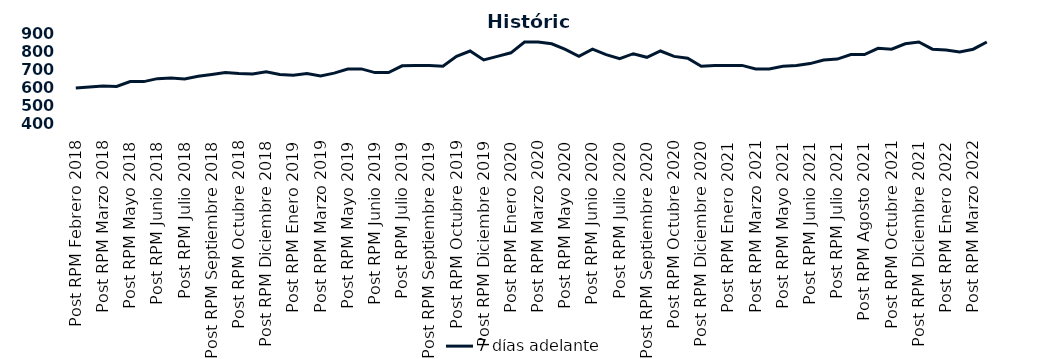
| Category | 7 días adelante  |
|---|---|
| Post RPM Febrero 2018 | 595 |
| Pre RPM Marzo 2018 | 600 |
| Post RPM Marzo 2018 | 605 |
| Pre RPM Mayo 2018 | 603 |
| Post RPM Mayo 2018 | 630 |
| Pre RPM Junio 2018 | 630 |
| Post RPM Junio 2018 | 646.5 |
| Pre RPM Julio 2018 | 650 |
| Post RPM Julio 2018 | 645 |
| Pre RPM Septiembre 2018 | 660 |
| Post RPM Septiembre 2018 | 670 |
| Pre RPM Octubre 2018 | 680 |
| Post RPM Octubre 2018 | 675 |
| Pre RPM Diciembre 2018 | 672.5 |
| Post RPM Diciembre 2018 | 685 |
| Pre RPM Enero 2019 | 670 |
| Post RPM Enero 2019 | 665 |
| Pre RPM Marzo 2019 | 675 |
| Post RPM Marzo 2019 | 661 |
| Pre RPM Mayo 2019 | 677 |
| Post RPM Mayo 2019 | 700 |
| Pre RPM Junio 2019 | 700.5 |
| Post RPM Junio 2019 | 680 |
| Pre RPM Julio 2019 | 680 |
| Post RPM Julio 2019 | 717.5 |
| Pre RPM Septiembre 2019 | 720 |
| Post RPM Septiembre 2019 | 720 |
| Pre RPM Octubre 2019 | 715 |
| Post RPM Octubre 2019 | 770 |
| Pre RPM Diciembre 2019 | 800 |
| Post RPM Diciembre 2019 | 750 |
| Pre RPM Enero 2020 | 770 |
| Post RPM Enero 2020 | 790 |
| Pre RPM Marzo 2020 | 850 |
| Post RPM Marzo 2020 | 850 |
| Pre RPM Mayo 2020 | 840 |
| Post RPM Mayo 2020 | 808.5 |
| Pre RPM Junio 2020 | 770 |
| Post RPM Junio 2020 | 810 |
| Pre RPM Julio 2020 | 780 |
| Post RPM Julio 2020 | 757 |
| Pre RPM Septiembre 2020 | 785 |
| Post RPM Septiembre 2020 | 765 |
| Pre RPM Octubre 2020 | 800 |
| Post RPM Octubre 2020 | 770 |
| Pre RPM Diciembre 2020 | 760 |
| Post RPM Diciembre 2020 | 715 |
| Pre RPM Enero 2021 | 720 |
| Post RPM Enero 2021 | 720 |
| Pre RPM Marzo 2021 | 720 |
| Post RPM Marzo 2021 | 700 |
| Pre RPM Mayo 2021 | 700 |
| Post RPM Mayo 2021 | 715 |
| Pre RPM Junio 2021 | 720 |
| Post RPM Junio 2021 | 730 |
| Pre RPM Julio 2021 | 750 |
| Post RPM Julio 2021 | 755 |
| Pre RPM Agosto 2021 | 780 |
| Post RPM Agosto 2021 | 780 |
| Pre RPM Octubre 2021 | 815 |
| Post RPM Octubre 2021 | 810 |
| Pre RPM Diciembre 2021 | 840 |
| Post RPM Diciembre 2021 | 850 |
| Pre RPM Enero 2022 | 810 |
| Post RPM Enero 2022 | 805 |
| Pre RPM Marzo 2022 | 795 |
| Post RPM Marzo 2022 | 810 |
| Pre RPM Mayo 2022 | 850 |